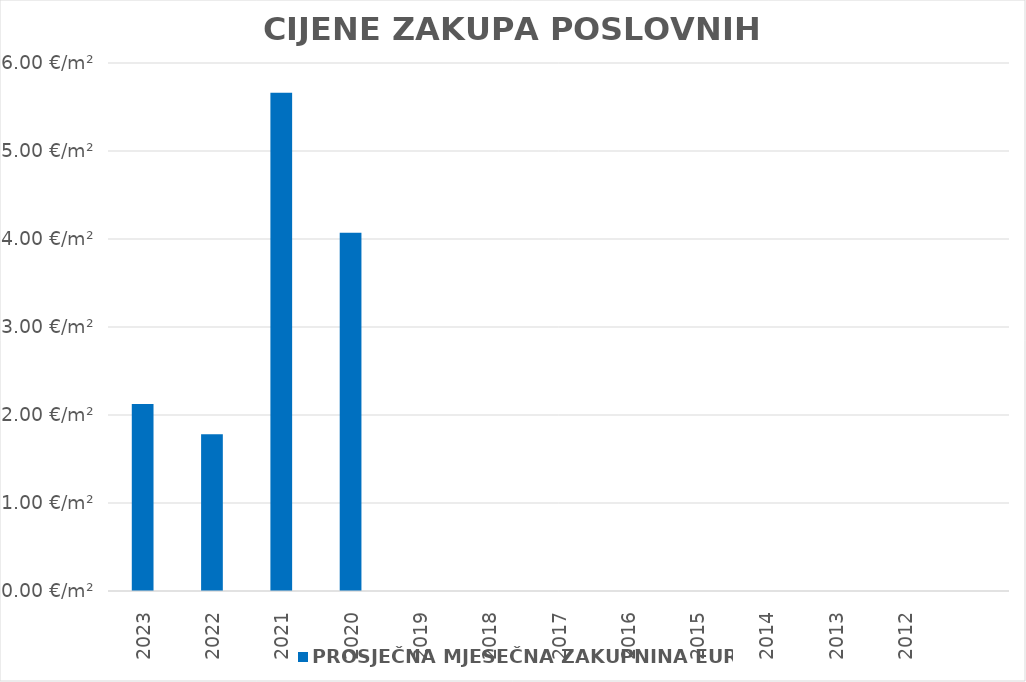
| Category | PROSJEČNA MJESEČNA ZAKUPNINA EUR/m2 |
|---|---|
| 2023 | 1900-01-02 03:00:27 |
| 2022 | 1900-01-01 18:46:05 |
| 2021 | 1900-01-05 15:54:52 |
| 2020 | 1900-01-04 01:42:36 |
| 2019 | 0 |
| 2018 | 0 |
| 2017 | 0 |
| 2016 | 0 |
| 2015 | 0 |
| 2014 | 0 |
| 2013 | 0 |
| 2012 | 0 |